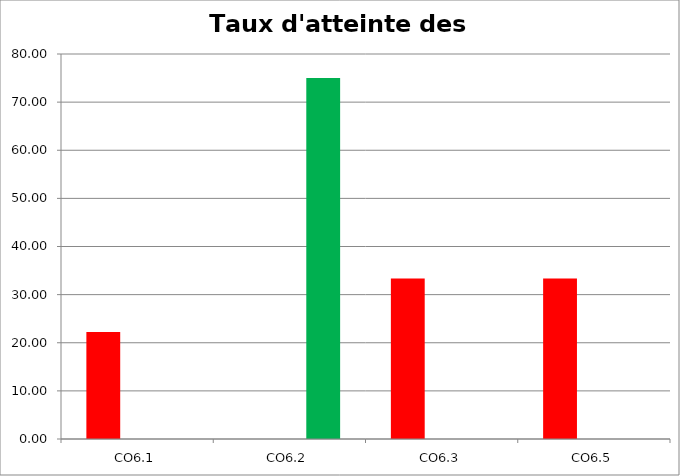
| Category | 0<Y<=33 | 33<Y<=66 | 66<Y<=100 |
|---|---|---|---|
| CO6.1 | 22.222 | 0 | 0 |
| CO6.2 | 0 | 0 | 75 |
| CO6.3 | 33.333 | 0 | 0 |
| CO6.5 | 33.333 | 0 | 0 |